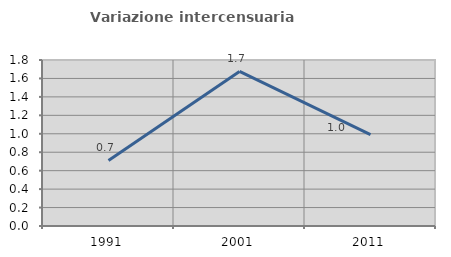
| Category | Variazione intercensuaria annua |
|---|---|
| 1991.0 | 0.711 |
| 2001.0 | 1.676 |
| 2011.0 | 0.992 |